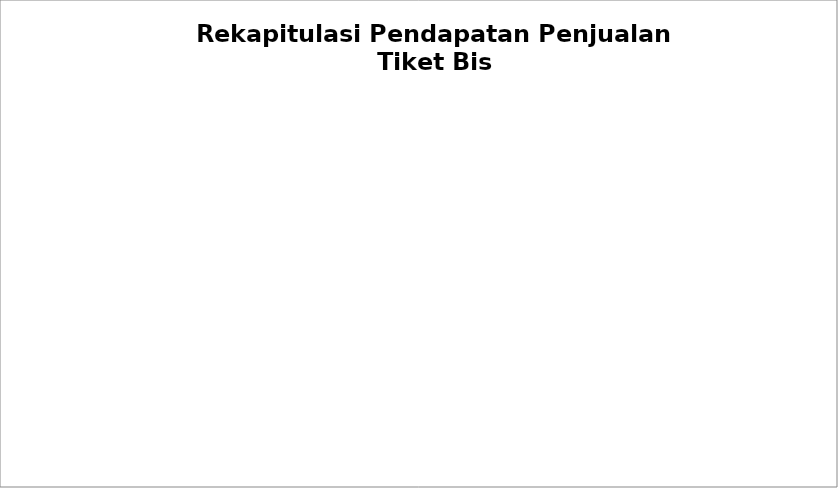
| Category | TOTAL PENDAPATAN |
|---|---|
| Lintas Sulawesi | 0 |
| Sinar Harapan | 0 |
| Trans Sulawesi | 0 |